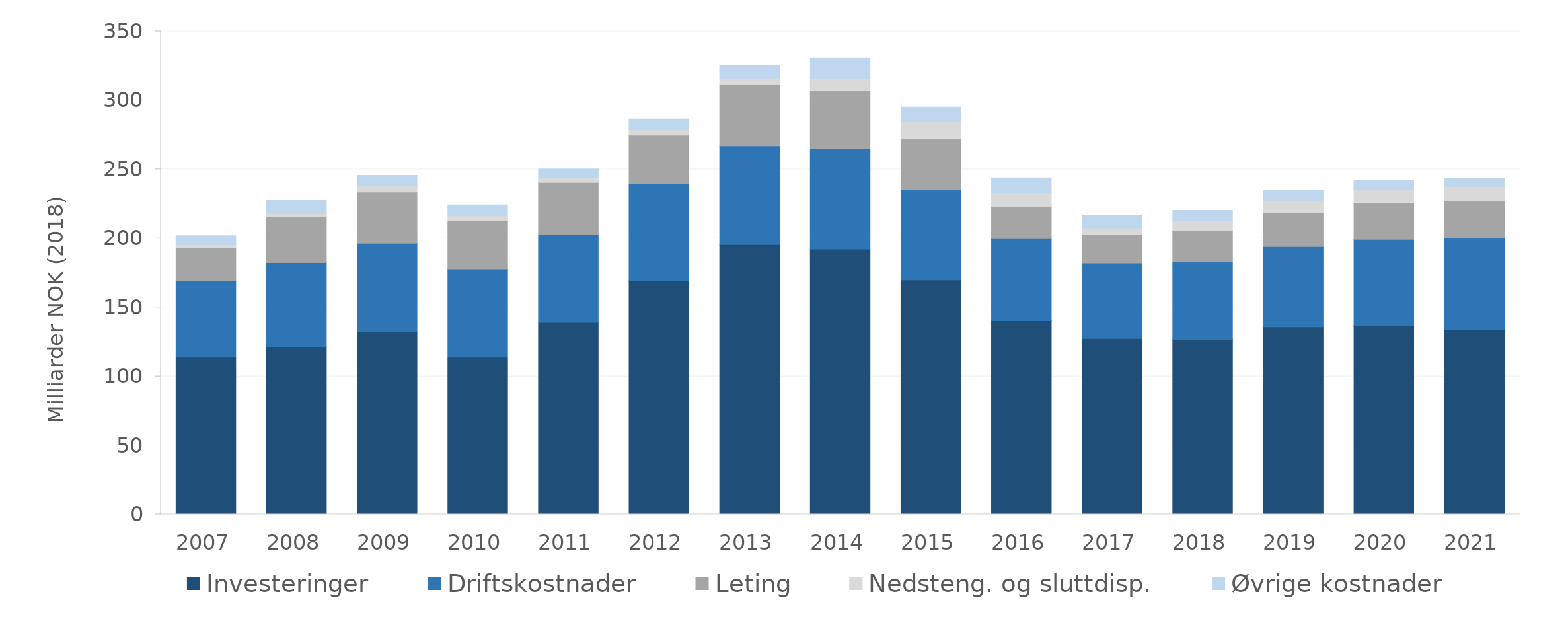
| Category | Investeringer | Driftskostnader | Leting | Nedsteng. og sluttdisp. | Øvrige kostnader |
|---|---|---|---|---|---|
| 2007.0 | 113.876 | 55.415 | 24.033 | 1.992 | 6.637 |
| 2008.0 | 121.487 | 60.912 | 33.446 | 2.088 | 9.606 |
| 2009.0 | 132.437 | 63.969 | 37.176 | 4.37 | 7.643 |
| 2010.0 | 113.858 | 63.97 | 34.84 | 3.846 | 7.66 |
| 2011.0 | 139.053 | 63.692 | 37.713 | 3.543 | 6.332 |
| 2012.0 | 169.37 | 70.2 | 35.139 | 3.807 | 7.903 |
| 2013.0 | 195.518 | 71.566 | 44.227 | 4.82 | 9.222 |
| 2014.0 | 192.287 | 72.457 | 42.14 | 8.746 | 14.819 |
| 2015.0 | 169.859 | 65.344 | 36.86 | 12.184 | 10.853 |
| 2016.0 | 140.228 | 59.557 | 23.333 | 9.997 | 10.7 |
| 2017.0 | 127.522 | 54.641 | 20.471 | 4.981 | 8.919 |
| 2018.0 | 126.869 | 56.08 | 22.645 | 7.059 | 7.576 |
| 2019.0 | 135.852 | 58.169 | 24.33 | 9.252 | 7.053 |
| 2020.0 | 136.896 | 62.441 | 26.31 | 9.717 | 6.463 |
| 2021.0 | 134.109 | 66.255 | 26.848 | 10.417 | 5.77 |